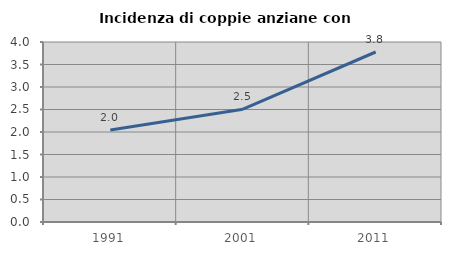
| Category | Incidenza di coppie anziane con figli |
|---|---|
| 1991.0 | 2.042 |
| 2001.0 | 2.507 |
| 2011.0 | 3.778 |